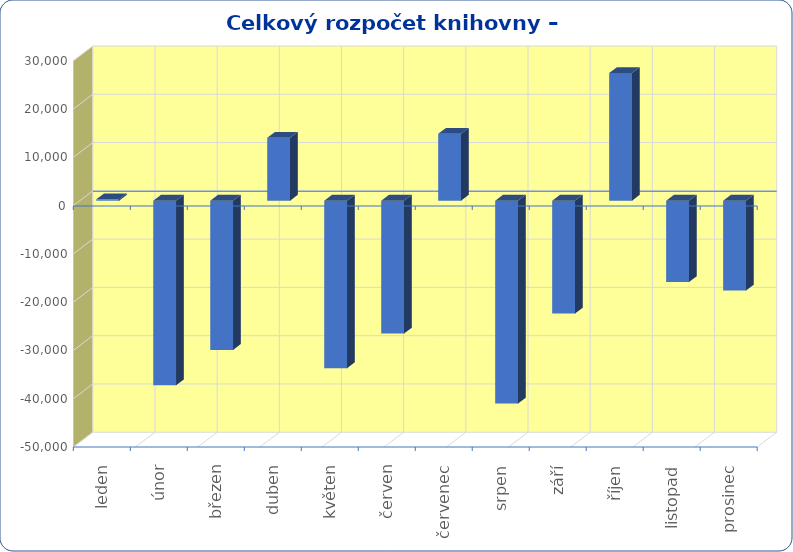
| Category | Series 0 |
|---|---|
| leden | 285 |
| únor | -38245 |
| březen | -30928 |
| duben | 13014 |
| květen | -34690 |
| červen | -27512 |
| červenec | 13859 |
| srpen | -42026 |
| září | -23378 |
| říjen | 26437 |
| listopad | -16861 |
| prosinec | -18606 |